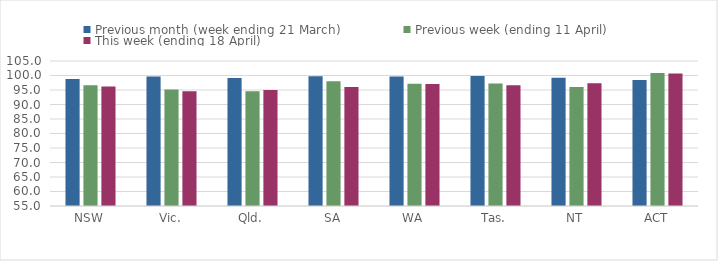
| Category | Previous month (week ending 21 March) | Previous week (ending 11 April) | This week (ending 18 April) |
|---|---|---|---|
| NSW | 98.827 | 96.612 | 96.209 |
| Vic. | 99.647 | 95.178 | 94.54 |
| Qld. | 99.177 | 94.579 | 94.99 |
| SA | 99.783 | 97.996 | 96.063 |
| WA | 99.648 | 97.182 | 97.031 |
| Tas. | 99.795 | 97.198 | 96.613 |
| NT | 99.241 | 96.048 | 97.291 |
| ACT | 98.408 | 100.89 | 100.672 |